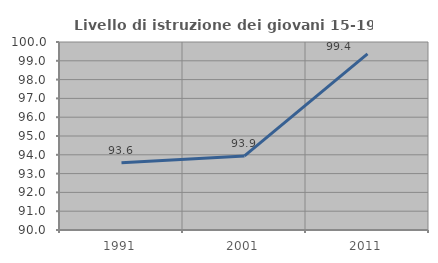
| Category | Livello di istruzione dei giovani 15-19 anni |
|---|---|
| 1991.0 | 93.583 |
| 2001.0 | 93.939 |
| 2011.0 | 99.367 |